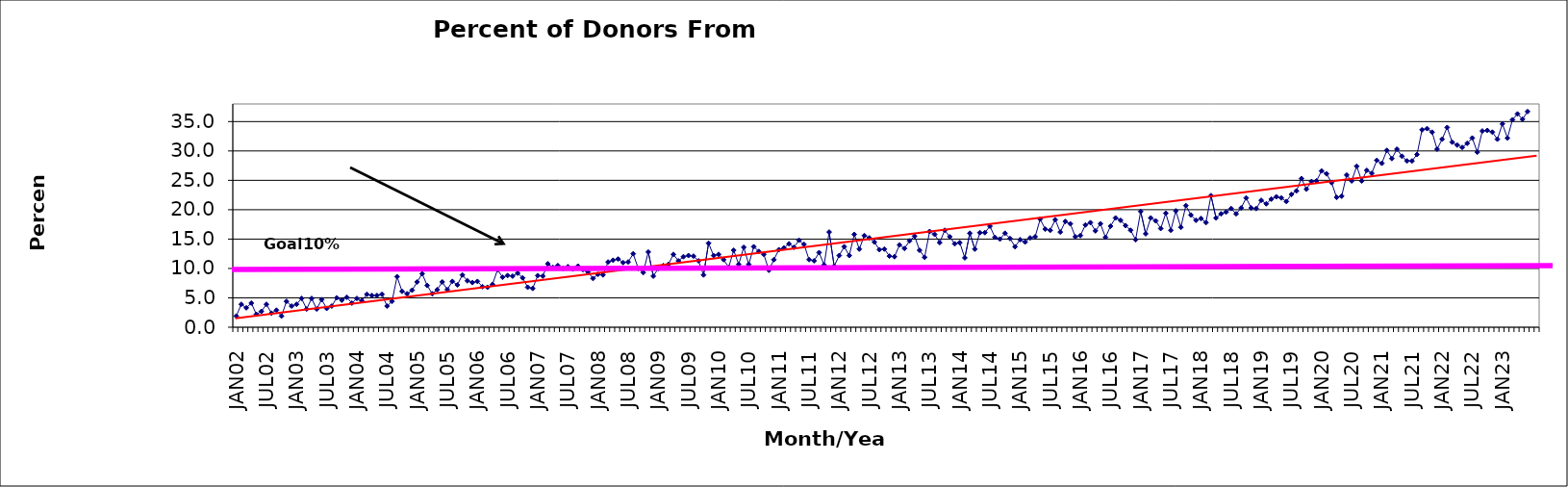
| Category | Series 0 |
|---|---|
| JAN02 | 1.9 |
| FEB02 | 3.9 |
| MAR02 | 3.3 |
| APR02 | 4.1 |
| MAY02 | 2.2 |
| JUN02 | 2.7 |
| JUL02 | 3.9 |
| AUG02 | 2.4 |
| SEP02 | 2.9 |
| OCT02 | 1.9 |
| NOV02 | 4.4 |
| DEC02 | 3.6 |
| JAN03 | 3.9 |
| FEB03 | 4.9 |
| MAR03 | 3.1 |
| APR03 | 4.9 |
| MAY03 | 3.1 |
| JUN03 | 4.7 |
| JUL03 | 3.2 |
| AUG03 | 3.6 |
| SEP03 | 5 |
| OCT03 | 4.6 |
| NOV03 | 5.1 |
| DEC03 | 4.1 |
| JAN04 | 4.9 |
| FEB04 | 4.5 |
| MAR04 | 5.6 |
| APR04 | 5.4 |
| MAY04 | 5.4 |
| JUN04 | 5.6 |
| JUL04 | 3.6 |
| AUG04 | 4.4 |
| SEP04 | 8.6 |
| OCT04 | 6.1 |
| NOV04 | 5.7 |
| DEC04 | 6.3 |
| JAN05 | 7.7 |
| FEB05 | 9.1 |
| MAR05 | 7.1 |
| APR05 | 5.7 |
| MAY05 | 6.4 |
| JUN05 | 7.7 |
| JUL05 | 6.4 |
| AUG05 | 7.8 |
| SEP05 | 7.2 |
| OCT05 | 8.9 |
| NOV05 | 7.9 |
| DEC05 | 7.6 |
| JAN06 | 7.8 |
| FEB06 | 6.9 |
| MAR06 | 6.8 |
| APR06 | 7.3 |
| MAY06 | 9.8 |
| JUN06 | 8.5 |
| JUL06 | 8.8 |
| AUG06 | 8.7 |
| SEP06 | 9.2 |
| OCT06 | 8.4 |
| NOV06 | 6.8 |
| DEC06 | 6.6 |
| JAN07 | 8.8 |
| FEB07 | 8.7 |
| MAR07 | 10.8 |
| APR07 | 10.2 |
| MAY07 | 10.5 |
| JUN07 | 10 |
| JUL07 | 10.3 |
| AUG07 | 9.9 |
| SEP07 | 10.4 |
| OCT07 | 9.8 |
| NOV07 | 9.4 |
| DEC07 | 8.3 |
| JAN08 | 9 |
| FEB08 | 8.9 |
| MAR08 | 11.1 |
| APR08 | 11.4 |
| MAY08 | 11.6 |
| JUN08 | 11 |
| JUL08 | 11.1 |
| AUG08 | 12.5 |
| SEP08 | 10 |
| OCT08 | 9.3 |
| NOV08 | 12.8 |
| DEC08 | 8.7 |
| JAN09 | 10 |
| FEB09 | 10.5 |
| MAR09 | 10.7 |
| APR09 | 12.4 |
| MAY09 | 11.3 |
| JUN09 | 12 |
| JUL09 | 12.2 |
| AUG09 | 12.1 |
| SEP09 | 11.3 |
| OCT09 | 8.9 |
| NOV09 | 14.3 |
| DEC09 | 12.2 |
| JAN10 | 12.4 |
| FEB10 | 11.5 |
| MAR10 | 10.2 |
| APR10 | 13.1 |
| MAY10 | 10.7 |
| JUN10 | 13.6 |
| JUL10 | 10.7 |
| AUG10 | 13.7 |
| SEP10 | 12.9 |
| OCT10 | 12.4 |
| NOV10 | 9.7 |
| DEC10 | 11.5 |
| JAN11 | 13.2 |
| FEB11 | 13.5 |
| MAR11 | 14.2 |
| APR11 | 13.6 |
| MAY11 | 14.8 |
| JUN11 | 14.1 |
| JUL11 | 11.5 |
| AUG11 | 11.3 |
| SEP11 | 12.7 |
| OCT11 | 10.6 |
| NOV11 | 16.2 |
| DEC11 | 10.4 |
| JAN12 | 12.2 |
| FEB12 | 13.7 |
| MAR12 | 12.2 |
| APR12 | 15.8 |
| MAY12 | 13.3 |
| JUN12 | 15.6 |
| JUL12 | 15.2 |
| AUG12 | 14.5 |
| SEP12 | 13.2 |
| OCT12 | 13.3 |
| NOV12 | 12.1 |
| DEC12 | 12 |
| JAN13 | 14 |
| FEB13 | 13.4 |
| MAR13 | 14.7 |
| APR13 | 15.5 |
| MAY13 | 13.1 |
| JUN13 | 11.9 |
| JUL13 | 16.3 |
| AUG13 | 15.8 |
| SEP13 | 14.4 |
| OCT13 | 16.5 |
| NOV13 | 15.4 |
| DEC13 | 14.2 |
| JAN14 | 14.4 |
| FEB14 | 11.8 |
| MAR14 | 16 |
| APR14 | 13.3 |
| MAY14 | 16.1 |
| JUN14 | 16.1 |
| JUL14 | 17.2 |
| AUG14 | 15.3 |
| SEP14 | 15 |
| OCT14 | 16 |
| NOV14 | 15.1 |
| DEC14 | 13.7 |
| JAN15 | 14.9 |
| FEB15 | 14.5 |
| MAR15 | 15.2 |
| APR15 | 15.4 |
| MAY15 | 18.4 |
| JUN15 | 16.7 |
| JUL15 | 16.5 |
| AUG15 | 18.3 |
| SEP15 | 16.2 |
| OCT15 | 18 |
| NOV15 | 17.6 |
| DEC15 | 15.4 |
| JAN16 | 15.6 |
| FEB16 | 17.4 |
| MAR16 | 17.8 |
| APR16 | 16.4 |
| MAY16 | 17.6 |
| JUN16 | 15.3 |
| JUL16 | 17.2 |
| AUG16 | 18.6 |
| SEP16 | 18.2 |
| OCT16 | 17.3 |
| NOV16 | 16.5 |
| DEC16 | 14.9 |
| JAN17 | 19.7 |
| FEB17 | 15.9 |
| MAR17 | 18.6 |
| APR17 | 18.1 |
| MAY17 | 16.8 |
| JUN17 | 19.4 |
| JUL17 | 16.5 |
| AUG17 | 19.8 |
| SEP17 | 17 |
| OCT17 | 20.7 |
| NOV17 | 19.1 |
| DEC17 | 18.2 |
| JAN18 | 18.5 |
| FEB18 | 17.8 |
| MAR18 | 22.4 |
| APR18 | 18.6 |
| MAY18 | 19.3 |
| JUN18 | 19.6 |
| JUL18 | 20.2 |
| AUG18 | 19.3 |
| SEP18 | 20.3 |
| OCT18 | 22 |
| NOV18 | 20.3 |
| DEC18 | 20.2 |
| JAN19 | 21.6 |
| FEB19 | 21 |
| MAR19 | 21.8 |
| APR19 | 22.2 |
| MAY19 | 22 |
| JUN19 | 21.4 |
| JUL19 | 22.6 |
| AUG19 | 23.2 |
| SEP19 | 25.3 |
| OCT19 | 23.5 |
| NOV19 | 24.8 |
| DEC19 | 24.9 |
| JAN20 | 26.6 |
| FEB20 | 26.1 |
| MAR20 | 24.6 |
| APR20 | 22.1 |
| MAY20 | 22.3 |
| JUN20 | 25.9 |
| JUL20 | 24.9 |
| AUG20 | 27.4 |
| SEP20 | 24.9 |
| OCT20 | 26.7 |
| NOV20 | 26.2 |
| DEC20 | 28.4 |
| JAN21 | 27.9 |
| FEB21 | 30.1 |
| MAR21 | 28.7 |
| APR21 | 30.3 |
| MAY21 | 29.1 |
| JUN21 | 28.3 |
| JUL21 | 28.3 |
| AUG21 | 29.4 |
| SEP21 | 33.6 |
| OCT21 | 33.8 |
| NOV21 | 33.2 |
| DEC21 | 30.3 |
| JAN22 | 32 |
| FEB22 | 34 |
| MAR22 | 31.5 |
| APR22 | 31 |
| MAY22 | 30.6 |
| JUN22 | 31.3 |
| JUL22 | 32.2 |
| AUG22 | 29.8 |
| SEP22 | 33.4 |
| OCT22 | 33.5 |
| NOV22 | 33.2 |
| DEC22 | 32 |
| JAN23 | 34.6 |
| FEB23 | 32.2 |
| MAR23 | 35.3 |
| APR23 | 36.3 |
| MAY23 | 35.4 |
| JUN23 | 36.7 |